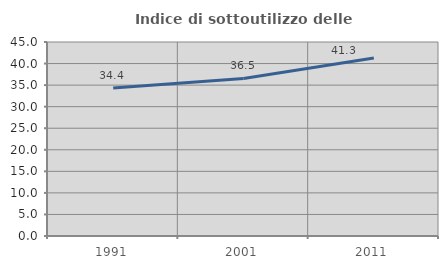
| Category | Indice di sottoutilizzo delle abitazioni  |
|---|---|
| 1991.0 | 34.357 |
| 2001.0 | 36.547 |
| 2011.0 | 41.302 |